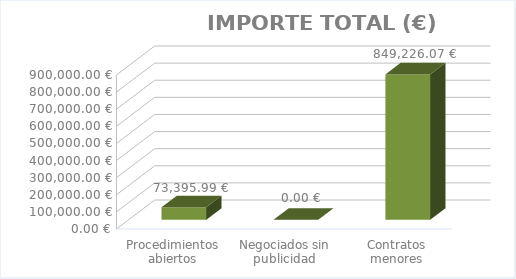
| Category | Series 0 |
|---|---|
| Procedimientos abiertos | 73395.99 |
| Negociados sin publicidad | 0 |
| Contratos menores | 849226.07 |